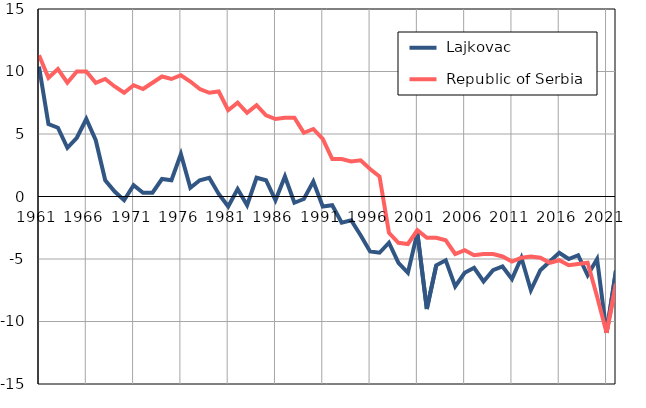
| Category |  Lajkovac |  Republic of Serbia |
|---|---|---|
| 1961.0 | 10.4 | 11.3 |
| 1962.0 | 5.8 | 9.5 |
| 1963.0 | 5.5 | 10.2 |
| 1964.0 | 3.9 | 9.1 |
| 1965.0 | 4.7 | 10 |
| 1966.0 | 6.2 | 10 |
| 1967.0 | 4.5 | 9.1 |
| 1968.0 | 1.3 | 9.4 |
| 1969.0 | 0.4 | 8.8 |
| 1970.0 | -0.3 | 8.3 |
| 1971.0 | 0.9 | 8.9 |
| 1972.0 | 0.3 | 8.6 |
| 1973.0 | 0.3 | 9.1 |
| 1974.0 | 1.4 | 9.6 |
| 1975.0 | 1.3 | 9.4 |
| 1976.0 | 3.4 | 9.7 |
| 1977.0 | 0.7 | 9.2 |
| 1978.0 | 1.3 | 8.6 |
| 1979.0 | 1.5 | 8.3 |
| 1980.0 | 0.2 | 8.4 |
| 1981.0 | -0.8 | 6.9 |
| 1982.0 | 0.6 | 7.5 |
| 1983.0 | -0.7 | 6.7 |
| 1984.0 | 1.5 | 7.3 |
| 1985.0 | 1.3 | 6.5 |
| 1986.0 | -0.3 | 6.2 |
| 1987.0 | 1.6 | 6.3 |
| 1988.0 | -0.5 | 6.3 |
| 1989.0 | -0.2 | 5.1 |
| 1990.0 | 1.2 | 5.4 |
| 1991.0 | -0.8 | 4.6 |
| 1992.0 | -0.7 | 3 |
| 1993.0 | -2.1 | 3 |
| 1994.0 | -1.9 | 2.8 |
| 1995.0 | -3.1 | 2.9 |
| 1996.0 | -4.4 | 2.2 |
| 1997.0 | -4.5 | 1.6 |
| 1998.0 | -3.7 | -2.9 |
| 1999.0 | -5.3 | -3.7 |
| 2000.0 | -6.1 | -3.8 |
| 2001.0 | -2.9 | -2.7 |
| 2002.0 | -9 | -3.3 |
| 2003.0 | -5.5 | -3.3 |
| 2004.0 | -5.1 | -3.5 |
| 2005.0 | -7.2 | -4.6 |
| 2006.0 | -6.1 | -4.3 |
| 2007.0 | -5.7 | -4.7 |
| 2008.0 | -6.8 | -4.6 |
| 2009.0 | -5.9 | -4.6 |
| 2010.0 | -5.6 | -4.8 |
| 2011.0 | -6.6 | -5.2 |
| 2012.0 | -4.9 | -4.9 |
| 2013.0 | -7.5 | -4.8 |
| 2014.0 | -5.9 | -4.9 |
| 2015.0 | -5.2 | -5.3 |
| 2016.0 | -4.5 | -5.1 |
| 2017.0 | -5 | -5.5 |
| 2018.0 | -4.7 | -5.4 |
| 2019.0 | -6.3 | -5.3 |
| 2020.0 | -5 | -8 |
| 2021.0 | -10.9 | -10.9 |
| 2022.0 | -5.9 | -7 |